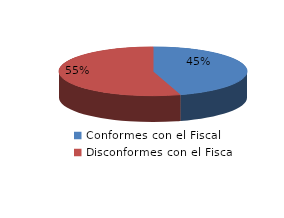
| Category | Series 0 |
|---|---|
| 0 | 29 |
| 1 | 35 |